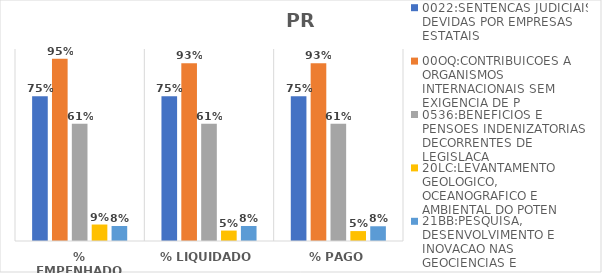
| Category | 0022:SENTENCAS JUDICIAIS DEVIDAS POR EMPRESAS ESTATAIS | 00OQ:CONTRIBUICOES A ORGANISMOS INTERNACIONAIS SEM EXIGENCIA DE P | 0536:BENEFICIOS E PENSOES INDENIZATORIAS DECORRENTES DE LEGISLACA | 20LC:LEVANTAMENTO GEOLOGICO, OCEANOGRAFICO E AMBIENTAL DO POTEN | 21BB:PESQUISA, DESENVOLVIMENTO E INOVACAO NAS GEOCIENCIAS E |
|---|---|---|---|---|---|
| % EMPENHADO | 0.754 | 0.95 | 0.611 | 0.086 | 0.078 |
| % LIQUIDADO | 0.754 | 0.926 | 0.611 | 0.054 | 0.078 |
| % PAGO | 0.754 | 0.926 | 0.611 | 0.052 | 0.077 |